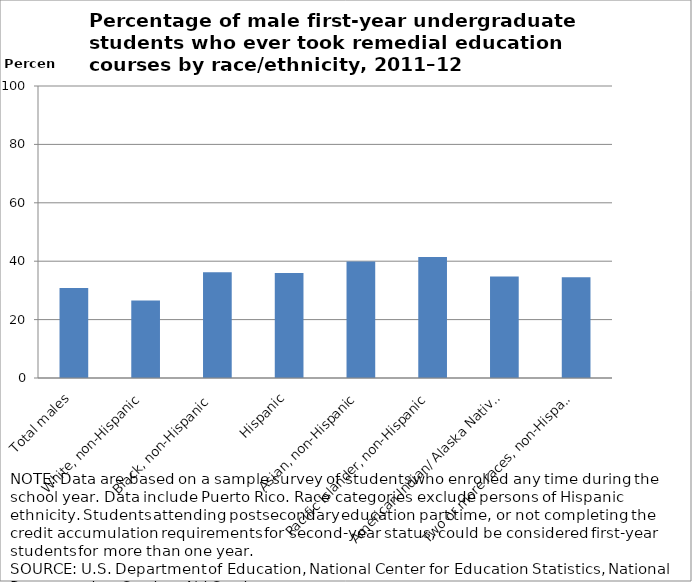
| Category | Series 1 |
|---|---|
| Total males | 30.8 |
| White, non-Hispanic | 26.5 |
| Black, non-Hispanic  | 36.2 |
| Hispanic | 36 |
| Asian, non-Hispanic | 39.9 |
| Pacific Islander, non-Hispanic | 41.4 |
| American Indian/ Alaska Native, non-Hispanic | 34.8 |
| Two or more races, non-Hispanic | 34.5 |